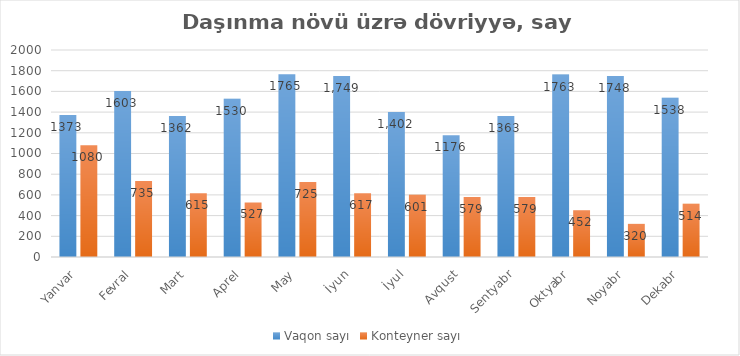
| Category | Vaqon sayı | Konteyner sayı |
|---|---|---|
| Yanvar | 1373 | 1080 |
| Fevral | 1603 | 735 |
| Mart | 1362 | 615 |
| Aprel | 1530 | 527 |
| May | 1765 | 725 |
| İyun | 1749 | 617 |
| İyul | 1402 | 601 |
| Avqust | 1176 | 579 |
| Sentyabr | 1363 | 579 |
| Oktyabr | 1763 | 452 |
| Noyabr | 1748 | 320 |
| Dekabr | 1538 | 514 |